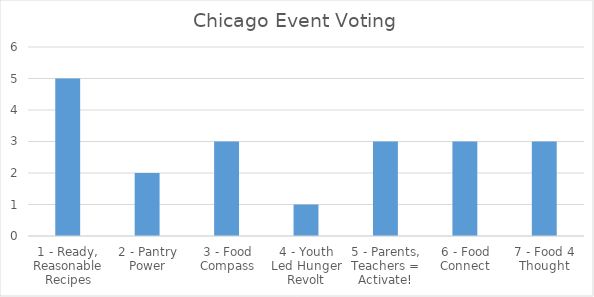
| Category | Chicago Event Voting |
|---|---|
| 1 - Ready, Reasonable Recipes | 5 |
| 2 - Pantry Power | 2 |
| 3 - Food Compass | 3 |
| 4 - Youth Led Hunger Revolt | 1 |
| 5 - Parents, Teachers = Activate! | 3 |
| 6 - Food Connect | 3 |
| 7 - Food 4 Thought | 3 |